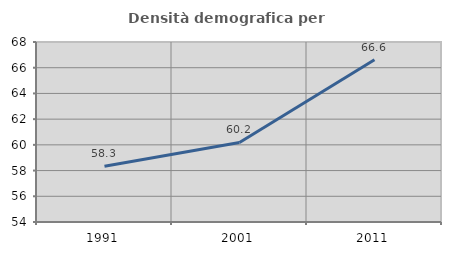
| Category | Densità demografica |
|---|---|
| 1991.0 | 58.336 |
| 2001.0 | 60.188 |
| 2011.0 | 66.618 |